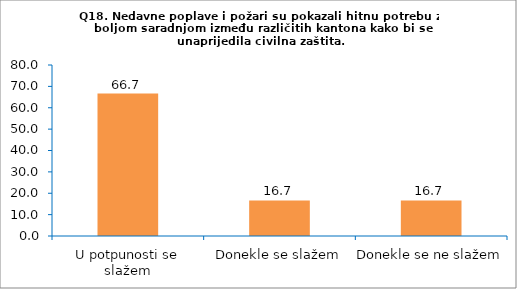
| Category | Series 0 |
|---|---|
| U potpunosti se slažem | 66.667 |
| Donekle se slažem | 16.667 |
| Donekle se ne slažem | 16.667 |